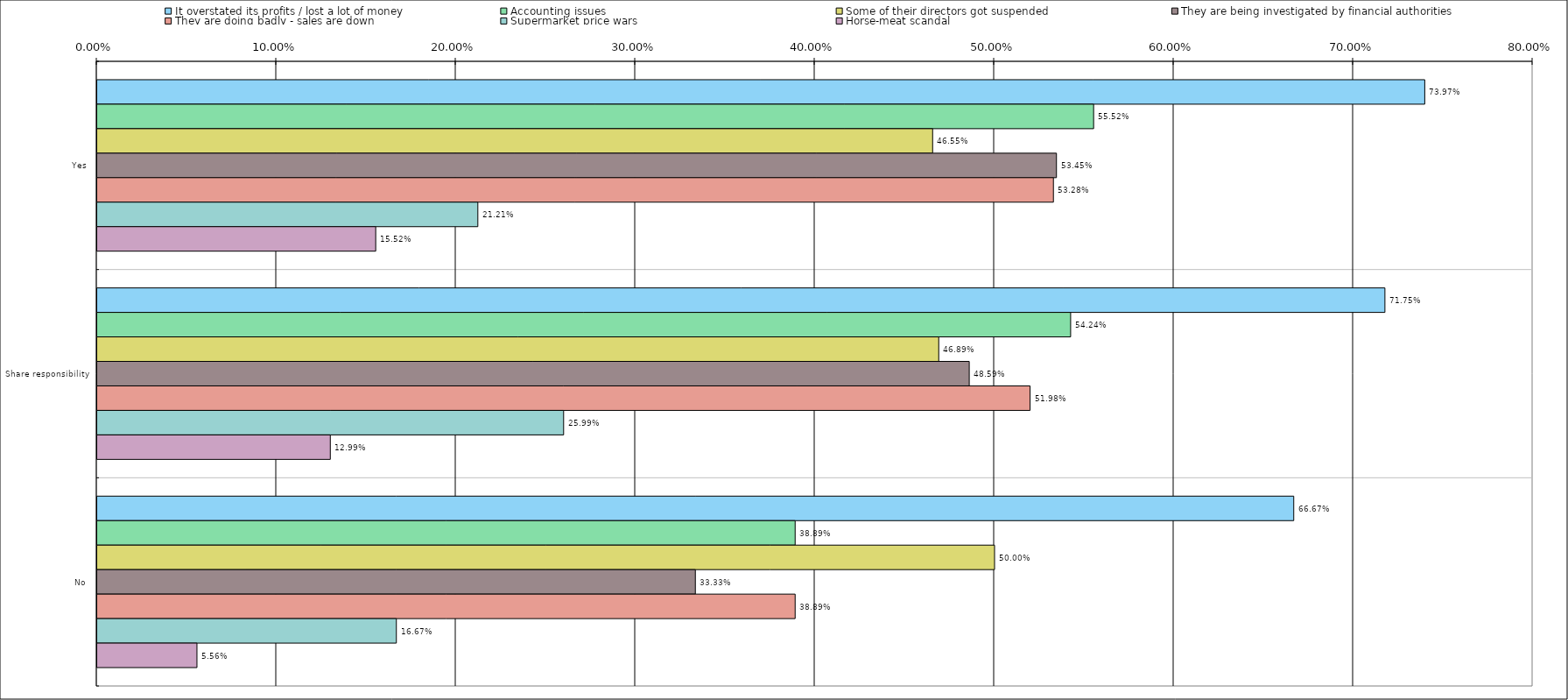
| Category | It overstated its profits / lost a lot of money | Accounting issues | Some of their directors got suspended | They are being investigated by financial authorities | They are doing badly - sales are down | Supermarket price wars | Horse-meat scandal |
|---|---|---|---|---|---|---|---|
| 0 | 0.74 | 0.555 | 0.466 | 0.534 | 0.533 | 0.212 | 0.155 |
| 1 | 0.718 | 0.542 | 0.469 | 0.486 | 0.52 | 0.26 | 0.13 |
| 2 | 0.667 | 0.389 | 0.5 | 0.333 | 0.389 | 0.167 | 0.056 |